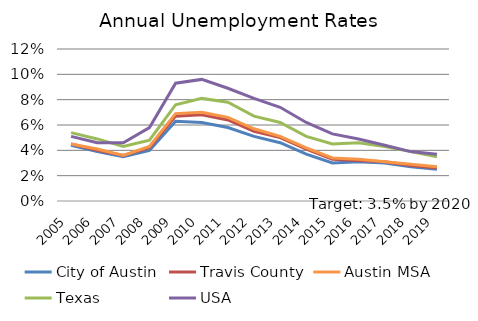
| Category | City of Austin | Travis County | Austin MSA | Texas | USA |
|---|---|---|---|---|---|
| 2005.0 | 0.044 | 0.045 | 0.045 | 0.054 | 0.051 |
| 2006.0 | 0.039 | 0.04 | 0.041 | 0.049 | 0.046 |
| 2007.0 | 0.035 | 0.036 | 0.036 | 0.043 | 0.046 |
| 2008.0 | 0.04 | 0.042 | 0.043 | 0.048 | 0.058 |
| 2009.0 | 0.063 | 0.067 | 0.069 | 0.076 | 0.093 |
| 2010.0 | 0.062 | 0.068 | 0.07 | 0.081 | 0.096 |
| 2011.0 | 0.058 | 0.064 | 0.066 | 0.078 | 0.089 |
| 2012.0 | 0.051 | 0.055 | 0.057 | 0.067 | 0.081 |
| 2013.0 | 0.046 | 0.05 | 0.051 | 0.062 | 0.074 |
| 2014.0 | 0.037 | 0.041 | 0.042 | 0.051 | 0.062 |
| 2015.0 | 0.03 | 0.033 | 0.034 | 0.045 | 0.053 |
| 2016.0 | 0.031 | 0.032 | 0.033 | 0.046 | 0.049 |
| 2017.0 | 0.03 | 0.031 | 0.031 | 0.043 | 0.044 |
| 2018.0 | 0.027 | 0.028 | 0.029 | 0.039 | 0.039 |
| 2019.0 | 0.025 | 0.026 | 0.027 | 0.035 | 0.037 |